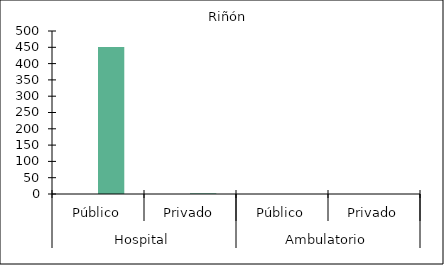
| Category |   |    Riñón |
|---|---|---|
| 0 | 0 | 451 |
| 1 | 0 | 2 |
| 2 | 0 | 0 |
| 3 | 0 | 0 |